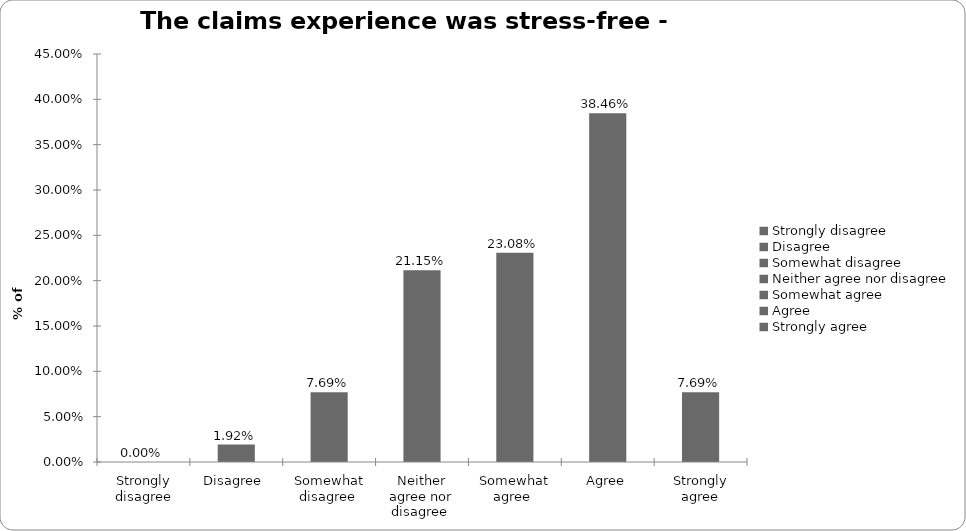
| Category | Motor |
|---|---|
| Strongly disagree | 0 |
| Disagree  | 0.019 |
| Somewhat disagree  | 0.077 |
| Neither agree nor disagree  | 0.212 |
| Somewhat agree  | 0.231 |
| Agree | 0.385 |
| Strongly agree | 0.077 |